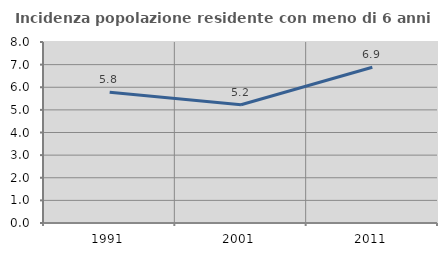
| Category | Incidenza popolazione residente con meno di 6 anni |
|---|---|
| 1991.0 | 5.782 |
| 2001.0 | 5.229 |
| 2011.0 | 6.886 |